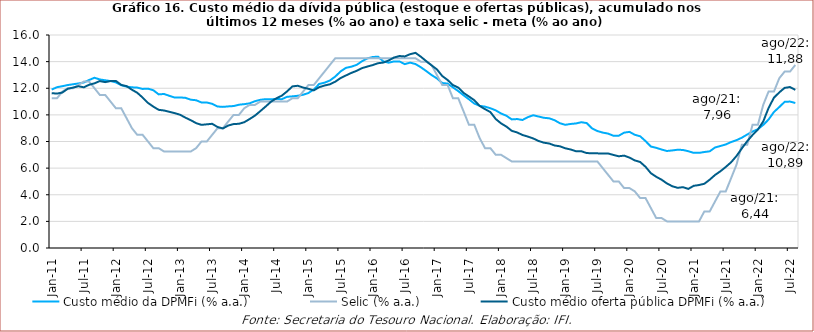
| Category | Custo médio da DPMFi (% a.a.) | Selic (% a.a.) | Custo médio oferta pública DPMFi (% a.a.) |
|---|---|---|---|
| 2011-01-31 | 11.9 | 11.25 | 11.63 |
| 2011-02-28 | 12.08 | 11.25 | 11.6 |
| 2011-03-31 | 12.155 | 11.75 | 11.68 |
| 2011-04-30 | 12.24 | 12 | 11.96 |
| 2011-05-31 | 12.3 | 12 | 12.05 |
| 2011-06-30 | 12.36 | 12.25 | 12.15 |
| 2011-07-31 | 12.43 | 12.5 | 12.07 |
| 2011-08-31 | 12.62 | 12.5 | 12.26 |
| 2011-09-30 | 12.79 | 12 | 12.37 |
| 2011-10-31 | 12.66 | 11.5 | 12.54 |
| 2011-11-30 | 12.6 | 11.5 | 12.46 |
| 2011-12-31 | 12.54 | 11 | 12.54 |
| 2012-01-31 | 12.44 | 10.5 | 12.55 |
| 2012-02-29 | 12.23 | 10.5 | 12.25 |
| 2012-03-31 | 12.12 | 9.75 | 12.16 |
| 2012-04-30 | 12.07 | 9 | 11.89 |
| 2012-05-31 | 12.05 | 8.5 | 11.66 |
| 2012-06-30 | 11.95 | 8.5 | 11.3 |
| 2012-07-31 | 11.97 | 8 | 10.9 |
| 2012-08-31 | 11.85 | 7.5 | 10.62 |
| 2012-09-30 | 11.54 | 7.5 | 10.38 |
| 2012-10-31 | 11.57 | 7.25 | 10.33 |
| 2012-11-30 | 11.43 | 7.25 | 10.23 |
| 2012-12-31 | 11.3 | 7.25 | 10.13 |
| 2013-01-31 | 11.31 | 7.25 | 10.01 |
| 2013-02-28 | 11.28 | 7.25 | 9.79 |
| 2013-03-31 | 11.14 | 7.25 | 9.6 |
| 2013-04-30 | 11.1 | 7.5 | 9.38 |
| 2013-05-31 | 10.93 | 8 | 9.25 |
| 2013-06-30 | 10.93 | 8 | 9.29 |
| 2013-07-31 | 10.83 | 8.5 | 9.33 |
| 2013-08-31 | 10.63 | 9 | 9.09 |
| 2013-09-30 | 10.6 | 9 | 8.98 |
| 2013-10-31 | 10.637 | 9.5 | 9.2 |
| 2013-11-30 | 10.663 | 10 | 9.31 |
| 2013-12-31 | 10.763 | 10 | 9.33 |
| 2014-01-31 | 10.805 | 10.5 | 9.449 |
| 2014-02-28 | 10.867 | 10.75 | 9.686 |
| 2014-03-31 | 11.027 | 10.75 | 9.946 |
| 2014-04-30 | 11.131 | 11 | 10.282 |
| 2014-05-31 | 11.182 | 11 | 10.629 |
| 2014-06-30 | 11.173 | 11 | 10.991 |
| 2014-07-31 | 11.197 | 11 | 11.246 |
| 2014-08-31 | 11.175 | 11 | 11.439 |
| 2014-09-30 | 11.356 | 11 | 11.764 |
| 2014-10-31 | 11.391 | 11.25 | 12.14 |
| 2014-11-30 | 11.435 | 11.25 | 12.187 |
| 2014-12-31 | 11.512 | 11.75 | 12.053 |
| 2015-01-31 | 11.643 | 12.25 | 11.956 |
| 2015-02-27 | 11.909 | 12.25 | 11.84 |
| 2015-03-31 | 12.323 | 12.75 | 12.08 |
| 2015-04-30 | 12.419 | 13.25 | 12.204 |
| 2015-05-31 | 12.579 | 13.75 | 12.297 |
| 2015-06-30 | 12.877 | 14.25 | 12.491 |
| 2015-07-31 | 13.263 | 14.25 | 12.765 |
| 2015-08-31 | 13.532 | 14.25 | 12.96 |
| 2015-09-30 | 13.618 | 14.25 | 13.15 |
| 2015-10-31 | 13.754 | 14.25 | 13.31 |
| 2015-11-30 | 14.029 | 14.25 | 13.51 |
| 2015-12-31 | 14.241 | 14.25 | 13.63 |
| 2016-01-31 | 14.346 | 14.25 | 13.74 |
| 2016-02-29 | 14.372 | 14.25 | 13.88 |
| 2016-03-31 | 14.015 | 14.25 | 13.93 |
| 2016-04-30 | 13.92 | 14.25 | 14.09 |
| 2016-05-31 | 14.016 | 14.25 | 14.31 |
| 2016-06-30 | 14.017 | 14.25 | 14.42 |
| 2016-07-31 | 13.814 | 14.25 | 14.39 |
| 2016-08-31 | 13.924 | 14.25 | 14.56 |
| 2016-09-30 | 13.82 | 14.25 | 14.66 |
| 2016-10-31 | 13.578 | 14 | 14.37 |
| 2016-11-30 | 13.296 | 14 | 14.04 |
| 2016-12-31 | 12.996 | 13.75 | 13.72 |
| 2017-01-31 | 12.739 | 13 | 13.42 |
| 2017-02-28 | 12.394 | 12.25 | 12.92 |
| 2017-03-31 | 12.351 | 12.25 | 12.62 |
| 2017-04-30 | 12.068 | 11.25 | 12.24 |
| 2017-05-31 | 11.784 | 11.25 | 12.05 |
| 2017-06-30 | 11.466 | 10.25 | 11.65 |
| 2017-07-31 | 11.168 | 9.25 | 11.38 |
| 2017-08-31 | 10.85 | 9.25 | 11.1 |
| 2017-09-30 | 10.68 | 8.25 | 10.67 |
| 2017-10-31 | 10.617 | 7.5 | 10.43 |
| 2017-11-30 | 10.498 | 7.5 | 10.21 |
| 2017-12-31 | 10.339 | 7 | 9.69 |
| 2018-01-31 | 10.104 | 7 | 9.36 |
| 2018-02-28 | 9.934 | 6.75 | 9.12 |
| 2018-03-31 | 9.659 | 6.5 | 8.8 |
| 2018-04-30 | 9.686 | 6.5 | 8.68 |
| 2018-05-31 | 9.617 | 6.5 | 8.49 |
| 2018-06-30 | 9.83 | 6.5 | 8.37 |
| 2018-07-31 | 9.971 | 6.5 | 8.23 |
| 2018-08-31 | 9.878 | 6.5 | 8.04 |
| 2018-09-30 | 9.78 | 6.5 | 7.91 |
| 2018-10-31 | 9.743 | 6.5 | 7.85 |
| 2018-11-30 | 9.6 | 6.5 | 7.7 |
| 2018-12-31 | 9.371 | 6.5 | 7.64 |
| 2019-01-31 | 9.254 | 6.5 | 7.49 |
| 2019-02-28 | 9.318 | 6.5 | 7.4 |
| 2019-03-31 | 9.355 | 6.5 | 7.27 |
| 2019-04-30 | 9.449 | 6.5 | 7.27 |
| 2019-05-31 | 9.385 | 6.5 | 7.13 |
| 2019-06-30 | 8.987 | 6.5 | 7.12 |
| 2019-07-31 | 8.788 | 6.5 | 7.11 |
| 2019-08-31 | 8.669 | 6 | 7.09 |
| 2019-09-30 | 8.594 | 5.5 | 7.1 |
| 2019-10-31 | 8.431 | 5 | 6.99 |
| 2019-11-30 | 8.435 | 5 | 6.89 |
| 2019-12-31 | 8.665 | 4.5 | 6.94 |
| 2020-01-31 | 8.723 | 4.5 | 6.79 |
| 2020-02-29 | 8.505 | 4.25 | 6.58 |
| 2020-03-31 | 8.392 | 3.75 | 6.46 |
| 2020-04-30 | 8.031 | 3.75 | 6.1 |
| 2020-05-31 | 7.621 | 3 | 5.62 |
| 2020-06-30 | 7.524 | 2.25 | 5.35 |
| 2020-07-31 | 7.398 | 2.25 | 5.13 |
| 2020-08-31 | 7.286 | 2 | 4.85 |
| 2020-09-30 | 7.331 | 2 | 4.64 |
| 2020-10-31 | 7.381 | 2 | 4.52 |
| 2020-11-30 | 7.365 | 2 | 4.57 |
| 2020-12-31 | 7.269 | 2 | 4.44 |
| 2021-01-31 | 7.146 | 2 | 4.67 |
| 2021-02-28 | 7.146 | 2 | 4.73 |
| 2021-03-31 | 7.21 | 2.75 | 4.827 |
| 2021-04-30 | 7.263 | 2.75 | 5.134 |
| 2021-05-31 | 7.552 | 3.5 | 5.488 |
| 2021-06-30 | 7.662 | 4.25 | 5.765 |
| 2021-07-31 | 7.779 | 4.25 | 6.089 |
| 2021-08-31 | 7.96 | 5.25 | 6.441 |
| 2021-09-30 | 8.099 | 6.25 | 6.909 |
| 2021-10-31 | 8.285 | 7.75 | 7.478 |
| 2021-11-30 | 8.523 | 7.75 | 8.018 |
| 2021-12-31 | 8.749 | 9.25 | 8.486 |
| 2022-01-31 | 8.922 | 9.25 | 8.896 |
| 2022-02-28 | 9.248 | 10.75 | 9.503 |
| 2022-03-31 | 9.652 | 11.75 | 10.519 |
| 2022-04-30 | 10.216 | 11.75 | 11.288 |
| 2022-05-31 | 10.585 | 12.75 | 11.688 |
| 2022-06-30 | 10.979 | 13.25 | 12.028 |
| 2022-07-31 | 11 | 13.25 | 12.091 |
| 2022-08-31 | 10.893 | 13.75 | 11.878 |